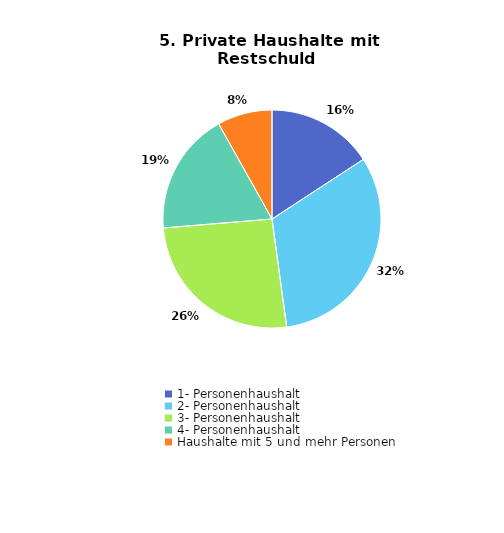
| Category | Series 1 |
|---|---|
| 1- Personenhaushalt | 0.158 |
| 2- Personenhaushalt | 0.321 |
| 3- Personenhaushalt | 0.258 |
| 4- Personenhaushalt | 0.182 |
| Haushalte mit 5 und mehr Personen | 0.081 |